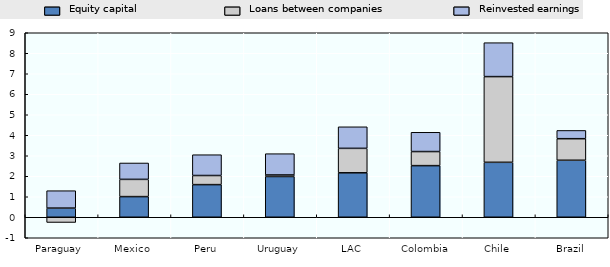
| Category | Equity capital | Loans between companies | Reinvested earnings |
|---|---|---|---|
| Paraguay | 0.447 | -0.255 | 0.849 |
| Mexico | 1.007 | 0.841 | 0.799 |
| Peru | 1.592 | 0.445 | 1.015 |
| Uruguay | 1.988 | 0.073 | 1.039 |
| LAC | 2.168 | 1.194 | 1.051 |
| Colombia | 2.518 | 0.687 | 0.94 |
| Chile | 2.68 | 4.181 | 1.654 |
| Brazil | 2.78 | 1.052 | 0.403 |